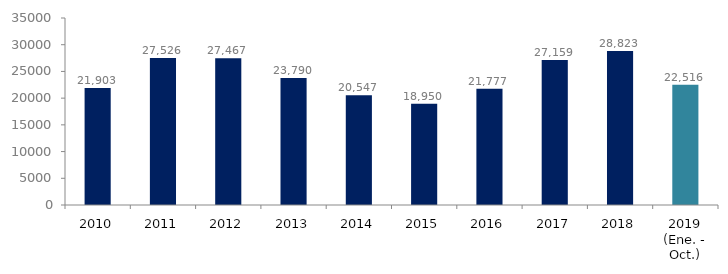
| Category | Series 1 |
|---|---|
| 2010 | 21903 |
| 2011 | 27526 |
| 2012 | 27467 |
| 2013 | 23790 |
| 2014 | 20547 |
| 2015 | 18950.14 |
| 2016 | 21776.636 |
| 2017 | 27158.582 |
| 2018 | 28823.486 |
| 2019 (Ene. - Oct.) | 22515.767 |